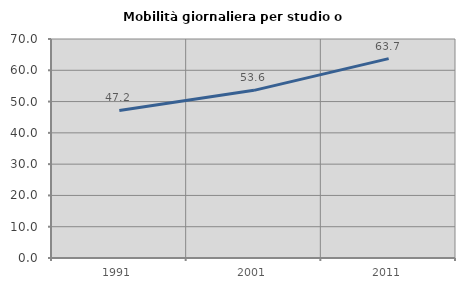
| Category | Mobilità giornaliera per studio o lavoro |
|---|---|
| 1991.0 | 47.152 |
| 2001.0 | 53.591 |
| 2011.0 | 63.723 |